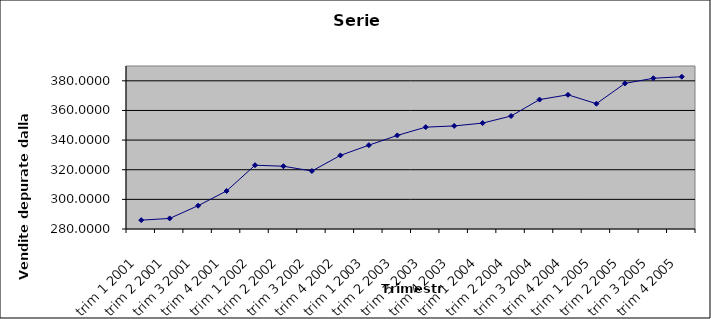
| Category | Serie detrendizzata |
|---|---|
| trim 1 2001 | 285.961 |
| trim 2 2001 | 287.147 |
| trim 3 2001 | 295.733 |
| trim 4 2001 | 305.659 |
| trim 1 2002 | 323.061 |
| trim 2 2002 | 322.347 |
| trim 3 2002 | 319.133 |
| trim 4 2002 | 329.659 |
| trim 1 2003 | 336.561 |
| trim 2 2003 | 343.147 |
| trim 3 2003 | 348.733 |
| trim 4 2003 | 349.559 |
| trim 1 2004 | 351.461 |
| trim 2 2004 | 356.247 |
| trim 3 2004 | 367.333 |
| trim 4 2004 | 370.559 |
| trim 1 2005 | 364.561 |
| trim 2 2005 | 378.247 |
| trim 3 2005 | 381.733 |
| trim 4 2005 | 382.759 |